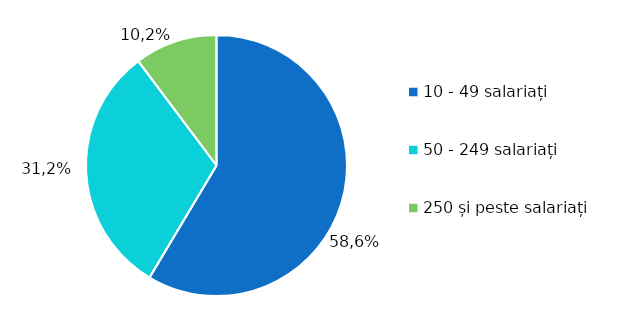
| Category | Series 0 |
|---|---|
| 10 - 49 salariați | 58.571 |
| 50 - 249 salariați | 31.19 |
| 250 și peste salariați | 10.238 |